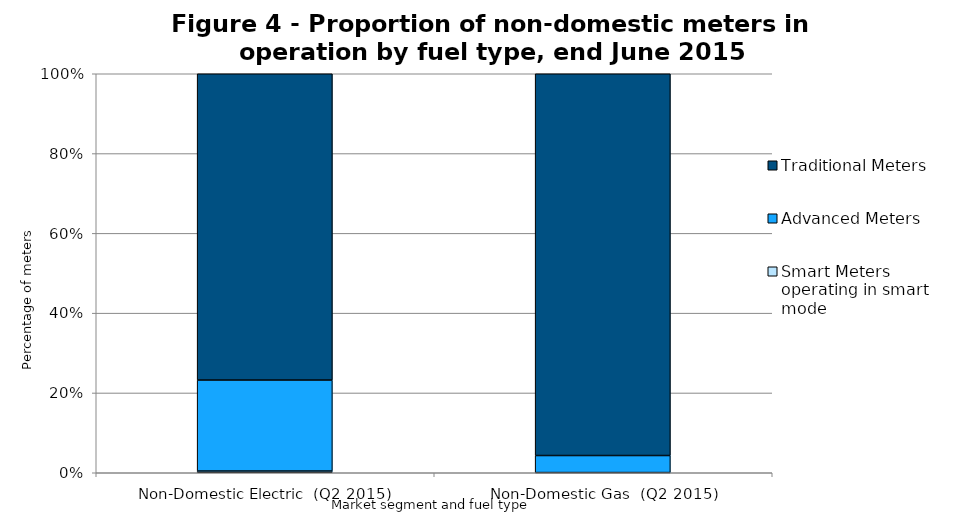
| Category | Smart Meters operating in smart mode | Advanced Meters | Traditional Meters |
|---|---|---|---|
| Non-Domestic Electric  (Q2 2015) | 9575 | 507897 | 1709885 |
| Non-Domestic Gas  (Q2 2015) | 227 | 20742 | 464729 |